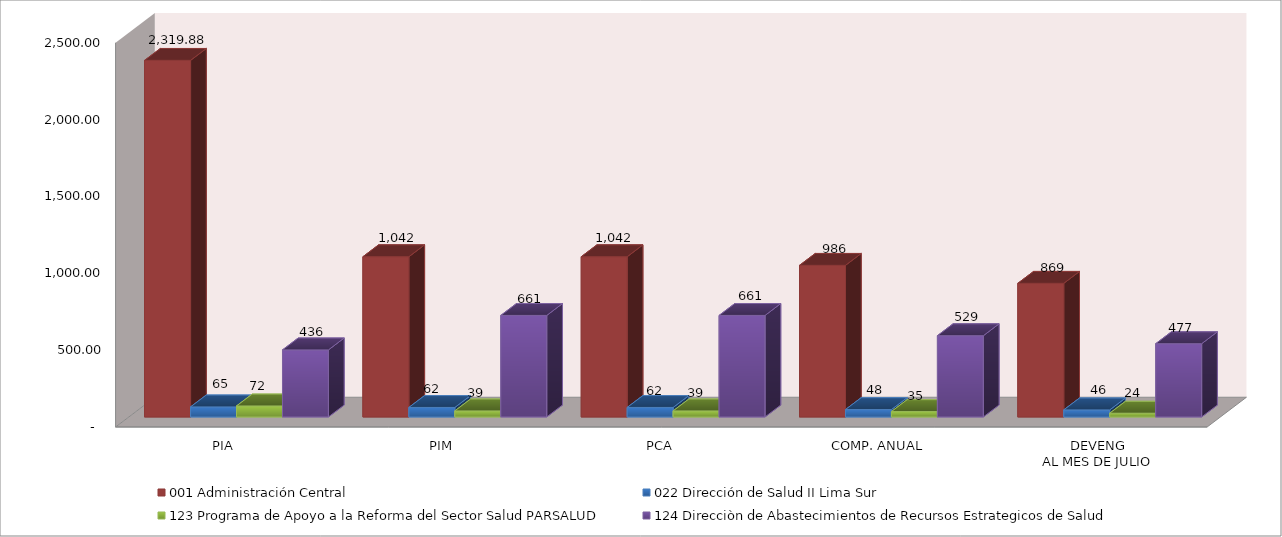
| Category | 001 Administración Central | 022 Dirección de Salud II Lima Sur | 123 Programa de Apoyo a la Reforma del Sector Salud PARSALUD | 124 Direcciòn de Abastecimientos de Recursos Estrategicos de Salud |
|---|---|---|---|---|
| PIA | 2319.877 | 65.372 | 71.532 | 436.35 |
| PIM | 1042.371 | 61.801 | 39.347 | 660.604 |
| PCA | 1042.371 | 61.801 | 39.347 | 660.604 |
| COMP. ANUAL | 986.301 | 48.041 | 35.112 | 528.757 |
| DEVENG
AL MES DE JULIO | 869.381 | 45.98 | 24.463 | 476.683 |